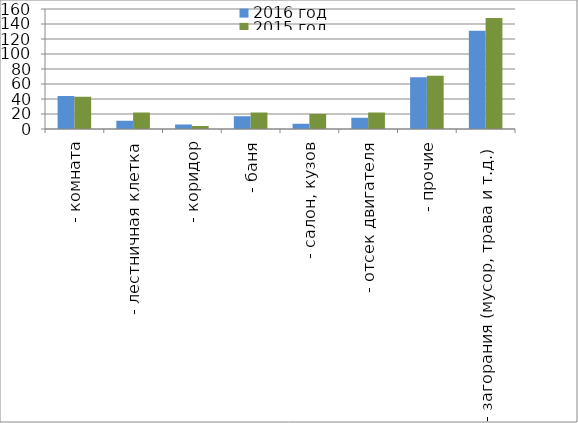
| Category | 2016 год | 2015 год |
|---|---|---|
|  - комната | 44 | 43 |
|  - лестничная клетка | 11 | 22 |
|  - коридор | 6 | 4 |
|  - баня | 17 | 22 |
|  - салон, кузов | 7 | 20 |
|  - отсек двигателя | 15 | 22 |
| - прочие | 69 | 71 |
| - загорания (мусор, трава и т.д.)  | 131 | 148 |